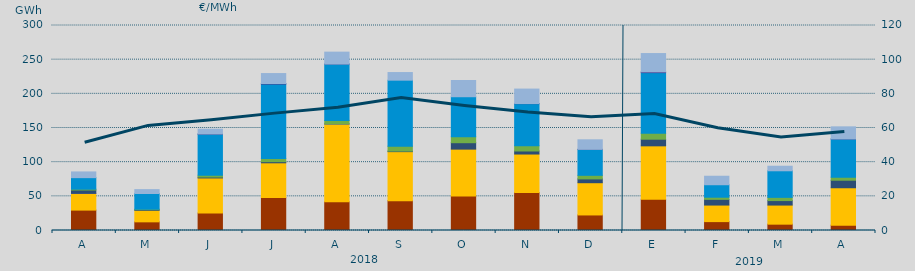
| Category | Carbón | Ciclo Combinado | Cogeneración | Consumo Bombeo | Eólica | Hidráulica | Nuclear | Turbinación bombeo |
|---|---|---|---|---|---|---|---|---|
| A | 29845.7 | 24356.1 | 74 | 4947.9 | 1233.1 | 16888.6 | 0 | 8367.7 |
| M | 12672 | 16812.4 | 0 | 952.5 | 730.5 | 23001.2 | 0 | 5631.5 |
| J | 25536.3 | 51382.8 | 0 | 1275.4 | 2784.2 | 59979.3 | 310 | 6998.5 |
| J | 48129.9 | 50935.7 | 0 | 1629.2 | 4531.2 | 109037.6 | 831.6 | 14563.8 |
| A | 41909.8 | 113971.2 | 10 | 188 | 5055.3 | 82431.3 | 20 | 17427.3 |
| S | 43665.8 | 71749.1 | 0 | 763.8 | 7207.5 | 96608.1 | 0 | 11156.8 |
| O | 50474 | 68624.5 | 0 | 9392.7 | 8694 | 58581.5 | 0 | 23733.8 |
| N | 55536.6 | 56365.7 | 0 | 4442.2 | 7624.8 | 61627.7 | 200 | 21168.7 |
| D | 22754.1 | 47185.3 | 0 | 5564.6 | 5249.4 | 37928.6 | 81 | 13945.1 |
| E | 45764.1 | 78136.9 | 0 | 9703.8 | 8718.7 | 88684.7 | 1159.3 | 26791.4 |
| F | 13008.4 | 24231.2 | 0 | 8329.6 | 3127.4 | 18281.1 | 0 | 12422.8 |
| M | 9261.4 | 27952 | 0 | 6580.9 | 4696.4 | 38895.4 | 0 | 6656.1 |
| A | 7813.1 | 54755.9 | 0 | 11010.9 | 4506.1 | 55784.8 | 149.4 | 17672.7 |